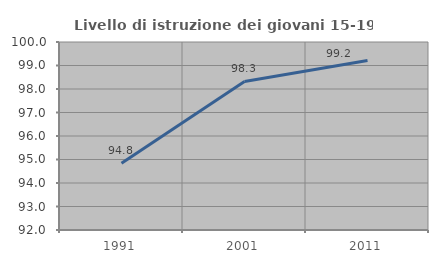
| Category | Livello di istruzione dei giovani 15-19 anni |
|---|---|
| 1991.0 | 94.837 |
| 2001.0 | 98.319 |
| 2011.0 | 99.213 |